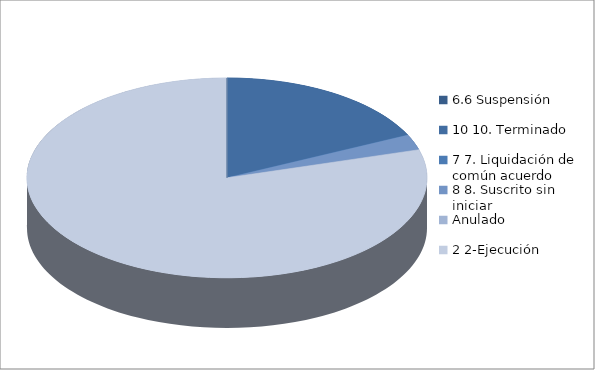
| Category | Series 0 |
|---|---|
| 6.6 Suspensión | 0 |
| 10 10. Terminado | 79 |
| 7 7. Liquidación de común acuerdo | 0 |
| 8 8. Suscrito sin iniciar | 11 |
| Anulado | 0 |
| 2 2-Ejecución | 350 |